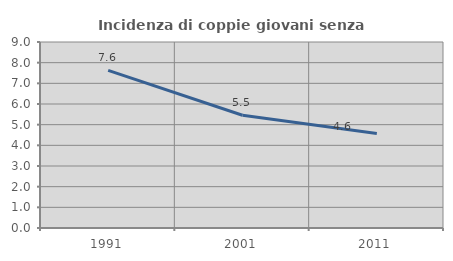
| Category | Incidenza di coppie giovani senza figli |
|---|---|
| 1991.0 | 7.623 |
| 2001.0 | 5.455 |
| 2011.0 | 4.578 |